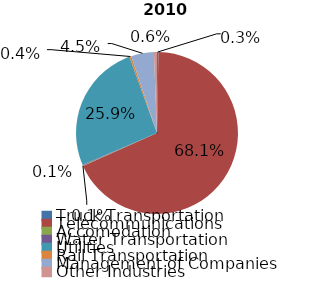
| Category | Series 0 |
|---|---|
| Truck Transportation | 1663004 |
| Telecommunications | 400787117 |
| Accomodation | 414872 |
| Water Transportation | 877946 |
| Utilities | 152532211 |
| Rail Transportation | 2283884 |
| Management of Companies | 26690185 |
| Other Industries | 3571272 |